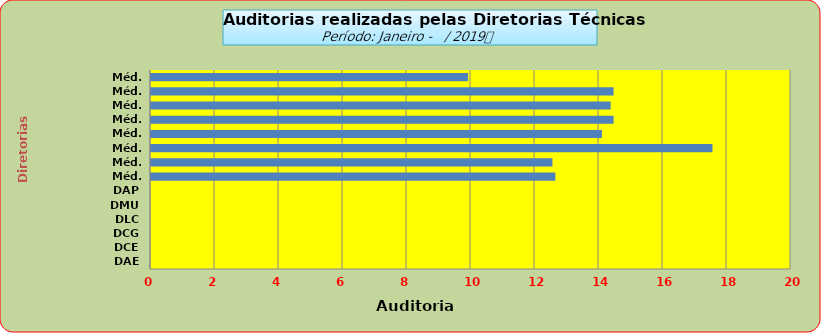
| Category | Series 0 |
|---|---|
| DAE | 0 |
| DCE | 0 |
| DCG | 0 |
| DLC | 0 |
| DMU | 0 |
| DAP | 0 |
| Méd. 2011 | 12.636 |
| Méd. 2012 | 12.545 |
| Méd. 2013 | 17.545 |
| Méd. 2014 | 14.091 |
| Méd. 2015 | 14.455 |
| Méd. 2016 | 14.364 |
| Méd. 2017 | 14.455 |
| Méd. 2018 | 9.909 |